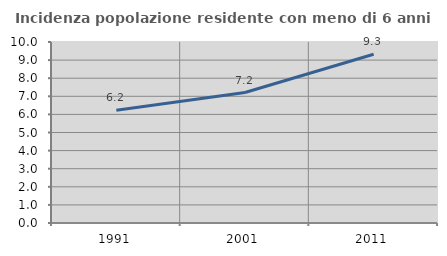
| Category | Incidenza popolazione residente con meno di 6 anni |
|---|---|
| 1991.0 | 6.23 |
| 2001.0 | 7.207 |
| 2011.0 | 9.323 |